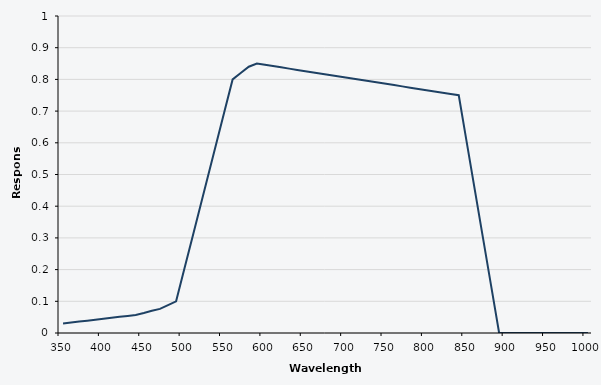
| Category | Series 0 |
|---|---|
| 350.0 | 0.03 |
| 360.0 | 0.033 |
| 370.0 | 0.036 |
| 380.0 | 0.039 |
| 390.0 | 0.042 |
| 400.0 | 0.045 |
| 410.0 | 0.048 |
| 420.0 | 0.051 |
| 430.0 | 0.054 |
| 440.0 | 0.057 |
| 450.0 | 0.063 |
| 460.0 | 0.07 |
| 470.0 | 0.076 |
| 480.0 | 0.088 |
| 490.0 | 0.1 |
| 500.0 | 0.2 |
| 510.0 | 0.3 |
| 520.0 | 0.4 |
| 530.0 | 0.5 |
| 540.0 | 0.6 |
| 550.0 | 0.7 |
| 560.0 | 0.8 |
| 570.0 | 0.82 |
| 580.0 | 0.84 |
| 590.0 | 0.85 |
| 600.0 | 0.846 |
| 610.0 | 0.842 |
| 620.0 | 0.838 |
| 630.0 | 0.834 |
| 640.0 | 0.83 |
| 650.0 | 0.826 |
| 660.0 | 0.822 |
| 670.0 | 0.818 |
| 680.0 | 0.814 |
| 690.0 | 0.81 |
| 700.0 | 0.806 |
| 710.0 | 0.802 |
| 720.0 | 0.798 |
| 730.0 | 0.794 |
| 740.0 | 0.79 |
| 750.0 | 0.786 |
| 760.0 | 0.782 |
| 770.0 | 0.778 |
| 780.0 | 0.774 |
| 790.0 | 0.77 |
| 800.0 | 0.766 |
| 810.0 | 0.762 |
| 820.0 | 0.758 |
| 830.0 | 0.754 |
| 840.0 | 0.75 |
| 850.0 | 0.6 |
| 860.0 | 0.45 |
| 870.0 | 0.3 |
| 880.0 | 0.15 |
| 890.0 | 0 |
| 900.0 | 0 |
| 910.0 | 0 |
| 920.0 | 0 |
| 930.0 | 0 |
| 940.0 | 0 |
| 950.0 | 0 |
| 960.0 | 0 |
| 970.0 | 0 |
| 980.0 | 0 |
| 990.0 | 0 |
| 1000.0 | 0 |